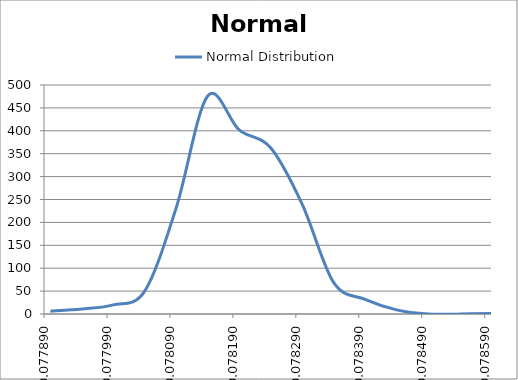
| Category | Normal Distribution |
|---|---|
| 0.0779 | 6 |
| 0.07795 | 11 |
| 0.078 | 20 |
| 0.07805 | 50 |
| 0.0781 | 232 |
| 0.07815 | 476 |
| 0.0782 | 402 |
| 0.0782500000000001 | 363 |
| 0.0783000000000001 | 240 |
| 0.0783500000000001 | 69 |
| 0.0784000000000001 | 32 |
| 0.0784500000000001 | 9 |
| 0.0785000000000001 | 0 |
| 0.0785500000000001 | 0 |
| 0.0786000000000001 | 1 |